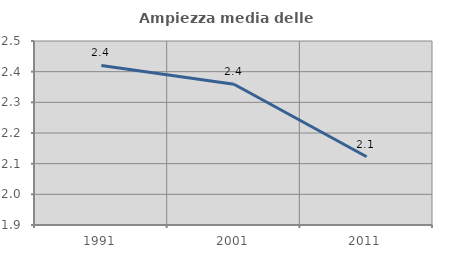
| Category | Ampiezza media delle famiglie |
|---|---|
| 1991.0 | 2.42 |
| 2001.0 | 2.359 |
| 2011.0 | 2.123 |